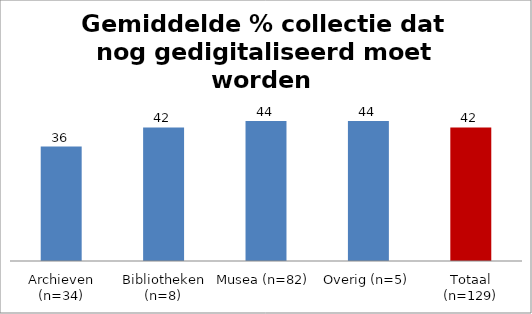
| Category | Series 0 |
|---|---|
| Archieven (n=34) | 36 |
| Bibliotheken (n=8) | 42 |
| Musea (n=82) | 44 |
| Overig (n=5) | 44 |
| Totaal (n=129) | 42 |